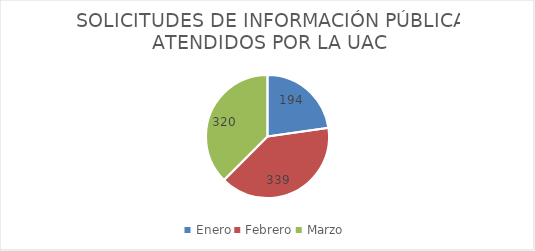
| Category | SOLICITUDES DE INFORMACIÓN PÚBLICA ATENDIDOS POR LA UAC |
|---|---|
| Enero | 194 |
| Febrero | 339 |
| Marzo | 320 |